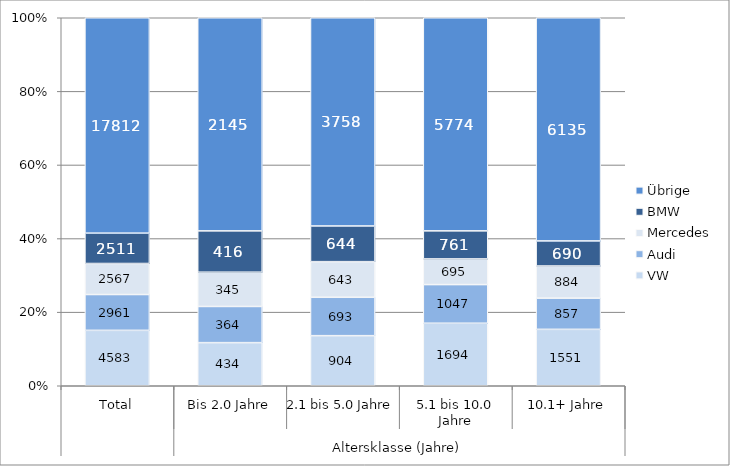
| Category | VW | Audi | Mercedes | BMW | Übrige |
|---|---|---|---|---|---|
| 0 | 4583 | 2961 | 2567 | 2511 | 17812 |
| 1 | 434 | 364 | 345 | 416 | 2145 |
| 2 | 904 | 693 | 643 | 644 | 3758 |
| 3 | 1694 | 1047 | 695 | 761 | 5774 |
| 4 | 1551 | 857 | 884 | 690 | 6135 |